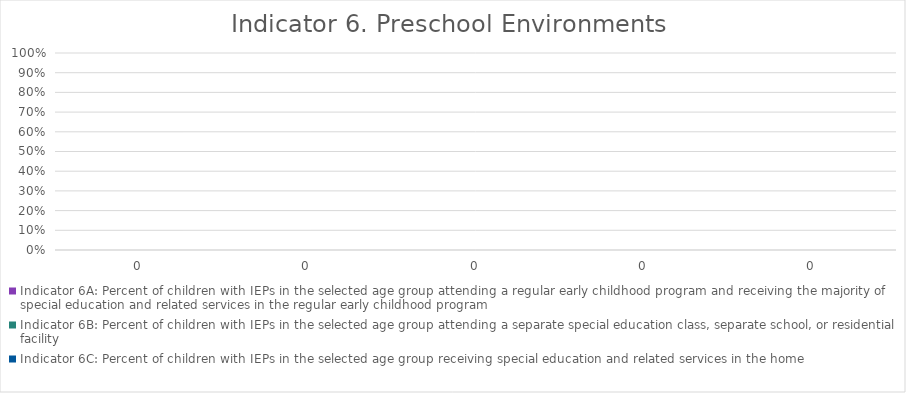
| Category | Indicator 6A: Percent of children with IEPs in the selected age group attending a regular early childhood program and receiving the majority of special education and related services in the regular early childhood program | Indicator 6B: Percent of children with IEPs in the selected age group attending a separate special education class, separate school, or residential facility | Indicator 6C: Percent of children with IEPs in the selected age group receiving special education and related services in the home |
|---|---|---|---|
| 0 | 0 | 0 | 0 |
| 0 | 0 | 0 | 0 |
| 0 | 0 | 0 | 0 |
| 0 | 0 | 0 | 0 |
| 0 | 0 | 0 | 0 |